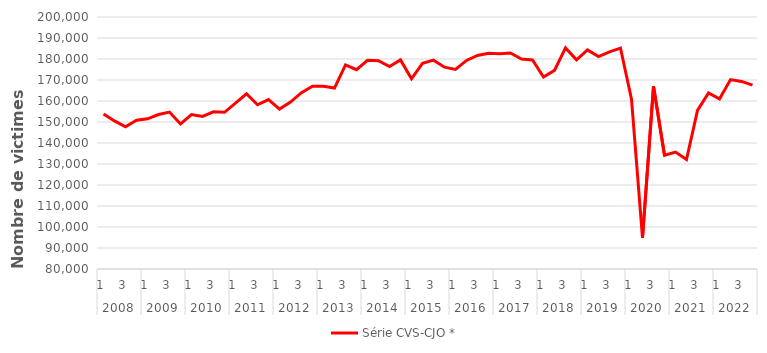
| Category | Série CVS-CJO * |
|---|---|
| 0 | 153822.266 |
| 1 | 150520.087 |
| 2 | 147718.761 |
| 3 | 150801.049 |
| 4 | 151521.143 |
| 5 | 153544.398 |
| 6 | 154746.117 |
| 7 | 149094.769 |
| 8 | 153518.513 |
| 9 | 152668.728 |
| 10 | 154841.213 |
| 11 | 154598.628 |
| 12 | 158969.076 |
| 13 | 163443.513 |
| 14 | 158185.562 |
| 15 | 160662.099 |
| 16 | 156165.366 |
| 17 | 159491.023 |
| 18 | 163991.553 |
| 19 | 167011.88 |
| 20 | 166973.655 |
| 21 | 166142.757 |
| 22 | 177152.217 |
| 23 | 174908.94 |
| 24 | 179402.879 |
| 25 | 179212.036 |
| 26 | 176398.883 |
| 27 | 179568.005 |
| 28 | 170547.204 |
| 29 | 177955.477 |
| 30 | 179464.842 |
| 31 | 176103.011 |
| 32 | 175012.063 |
| 33 | 179306.03 |
| 34 | 181696.423 |
| 35 | 182761.185 |
| 36 | 182503.783 |
| 37 | 182863.807 |
| 38 | 180023.088 |
| 39 | 179564.459 |
| 40 | 171403.128 |
| 41 | 174584.744 |
| 42 | 185269.985 |
| 43 | 179615.298 |
| 44 | 184296.017 |
| 45 | 181130.598 |
| 46 | 183439.436 |
| 47 | 185181.257 |
| 48 | 160850.912 |
| 49 | 94794.521 |
| 50 | 167031.548 |
| 51 | 134145.653 |
| 52 | 135652.429 |
| 53 | 132088.33 |
| 54 | 155550.498 |
| 55 | 163800.008 |
| 56 | 161012.283 |
| 57 | 170193.451 |
| 58 | 169312.872 |
| 59 | 167578.519 |